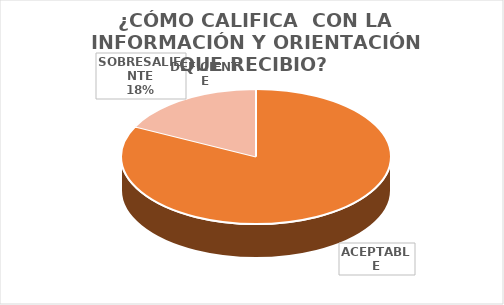
| Category | Series 0 |
|---|---|
| DEFICIENTE | 0 |
| ACEPTABLE | 14 |
| SOBRESALIENTE | 3 |